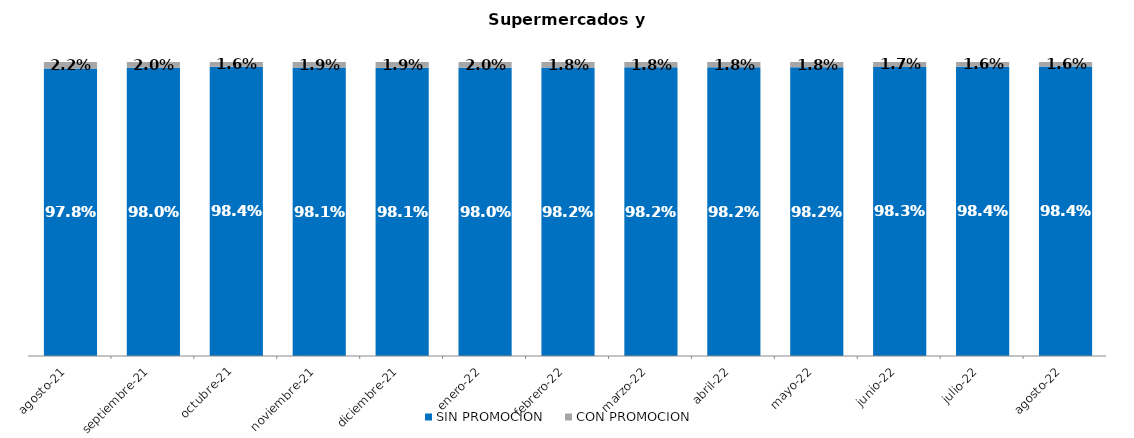
| Category | SIN PROMOCION   | CON PROMOCION   |
|---|---|---|
| 2021-08-01 | 0.978 | 0.022 |
| 2021-09-01 | 0.98 | 0.02 |
| 2021-10-01 | 0.984 | 0.016 |
| 2021-11-01 | 0.981 | 0.019 |
| 2021-12-01 | 0.981 | 0.019 |
| 2022-01-01 | 0.98 | 0.02 |
| 2022-02-01 | 0.982 | 0.018 |
| 2022-03-01 | 0.982 | 0.018 |
| 2022-04-01 | 0.982 | 0.018 |
| 2022-05-01 | 0.982 | 0.018 |
| 2022-06-01 | 0.983 | 0.017 |
| 2022-07-01 | 0.984 | 0.016 |
| 2022-08-01 | 0.984 | 0.016 |